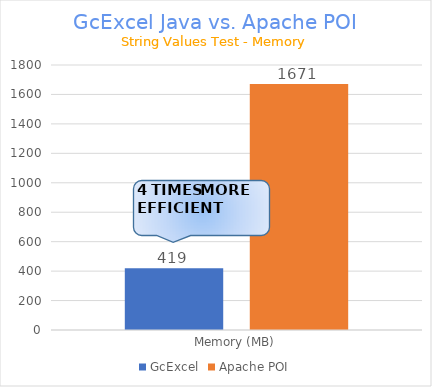
| Category | GcExcel | Apache POI |
|---|---|---|
| Memory (MB) | 419.395 | 1670.612 |